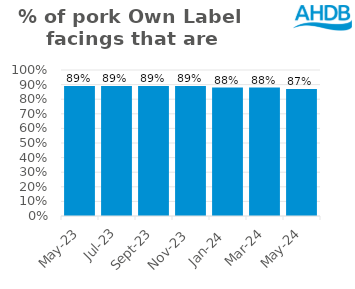
| Category | Pork |
|---|---|
| 2023-05-01 | 0.89 |
| 2023-07-01 | 0.89 |
| 2023-09-01 | 0.89 |
| 2023-11-01 | 0.89 |
| 2024-01-01 | 0.88 |
| 2024-03-01 | 0.88 |
| 2024-05-01 | 0.87 |